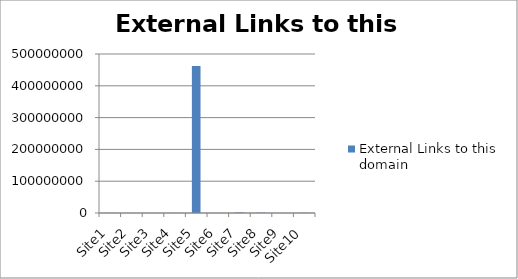
| Category | External Links to this domain |
|---|---|
| Site1 | 516773 |
| Site2 | 287 |
| Site3 | 13752 |
| Site4 | 290126 |
| Site5 | 462457127 |
| Site6 | 110936 |
| Site7 | 1826077 |
| Site8 | 928220 |
| Site9 | 215 |
| Site10 | 516773 |